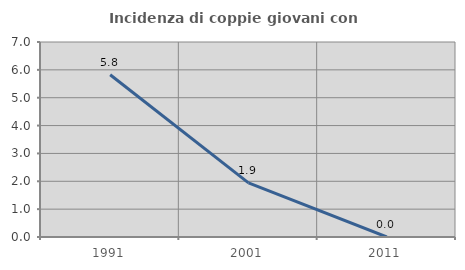
| Category | Incidenza di coppie giovani con figli |
|---|---|
| 1991.0 | 5.825 |
| 2001.0 | 1.942 |
| 2011.0 | 0 |